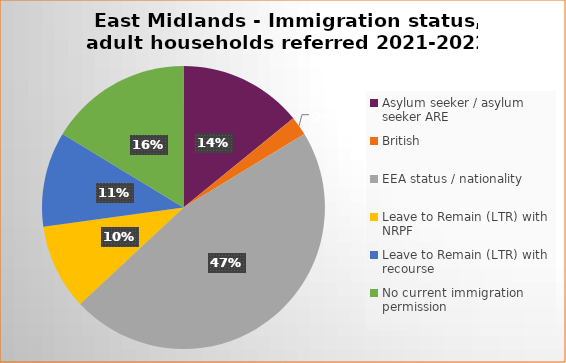
| Category | Number  | Percentage |
|---|---|---|
| Asylum seeker / asylum seeker ARE | 13 | 0.141 |
| British | 2 | 0.022 |
| EEA status / nationality  | 43 | 0.467 |
| Leave to Remain (LTR) with NRPF | 9 | 0.098 |
| Leave to Remain (LTR) with recourse | 10 | 0.109 |
| No current immigration permission | 15 | 0.163 |